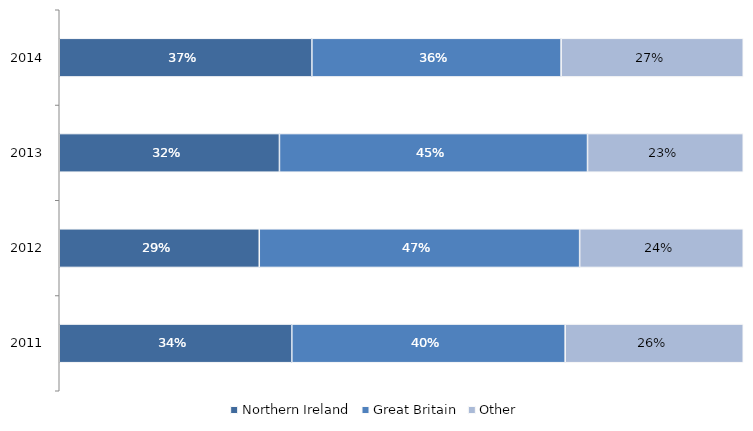
| Category | Northern Ireland | Great Britain | Other |
|---|---|---|---|
| 2011.0 | 0.34 | 0.4 | 0.26 |
| 2012.0 | 0.292 | 0.468 | 0.239 |
| 2013.0 | 0.322 | 0.45 | 0.228 |
| 2014.0 | 0.369 | 0.364 | 0.266 |